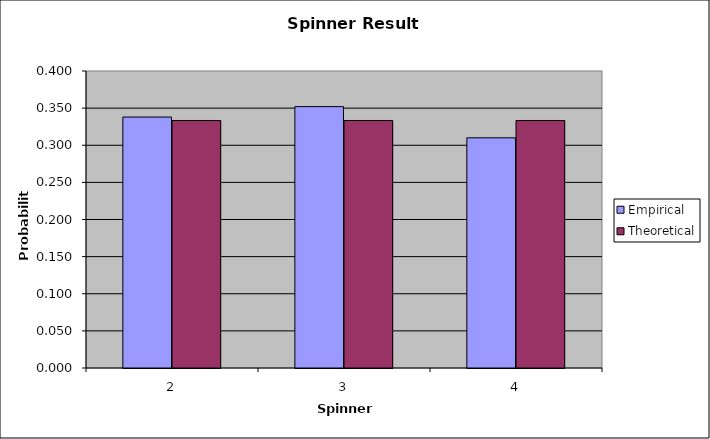
| Category | Empirical | Theoretical |
|---|---|---|
| 2.0 | 0.338 | 0.333 |
| 3.0 | 0.352 | 0.333 |
| 4.0 | 0.31 | 0.333 |